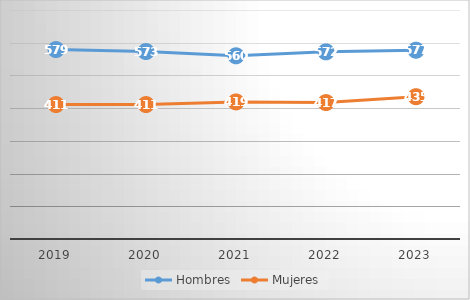
| Category | Hombres | Mujeres |
|---|---|---|
| 2019.0 | 579 | 411 |
| 2020.0 | 573 | 411 |
| 2021.0 | 560 | 419 |
| 2022.0 | 572 | 417 |
| 2023.0 | 577 | 435 |